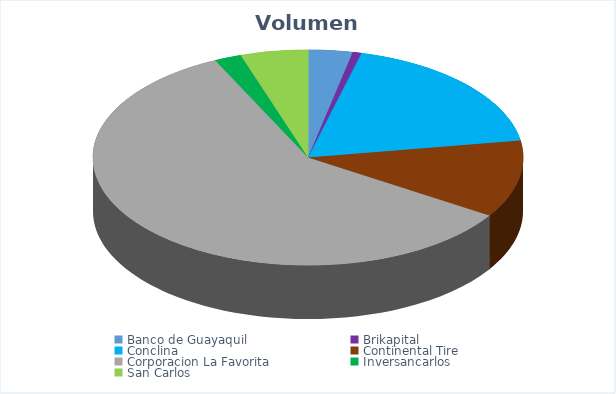
| Category | VOLUMEN ($USD) |
|---|---|
| Banco de Guayaquil | 5006.82 |
| Brikapital | 1000 |
| Conclina | 27755 |
| Continental Tire | 17414 |
| Corporacion La Favorita | 88448.4 |
| Inversancarlos | 3050 |
| San Carlos | 7605 |